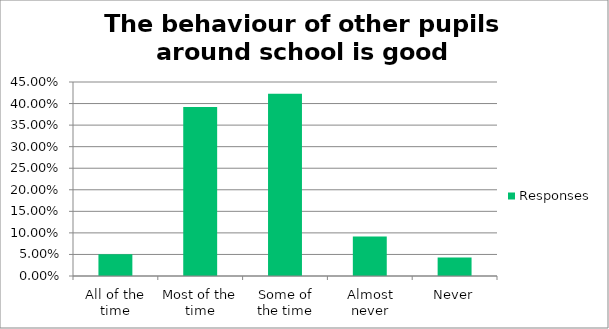
| Category | Responses |
|---|---|
| All of the time | 0.05 |
| Most of the time | 0.392 |
| Some of the time | 0.423 |
| Almost never | 0.092 |
| Never | 0.043 |